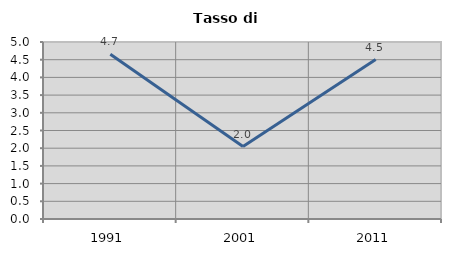
| Category | Tasso di disoccupazione   |
|---|---|
| 1991.0 | 4.654 |
| 2001.0 | 2.047 |
| 2011.0 | 4.506 |